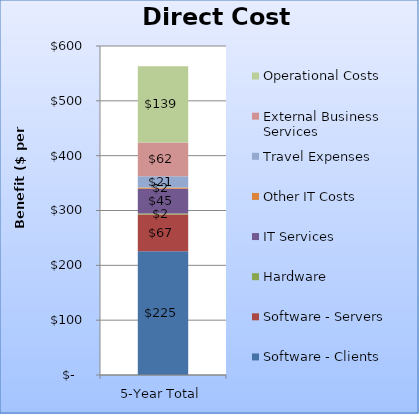
| Category | Software - Clients | Software - Servers | Hardware | IT Services | Other IT Costs | Travel Expenses | External Business Services | Operational Costs |
|---|---|---|---|---|---|---|---|---|
| 5-Year Total | 225.486 | 67.049 | 1.969 | 45.341 | 2.025 | 20.753 | 61.568 | 138.708 |